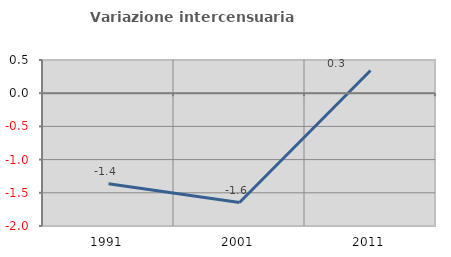
| Category | Variazione intercensuaria annua |
|---|---|
| 1991.0 | -1.363 |
| 2001.0 | -1.646 |
| 2011.0 | 0.342 |